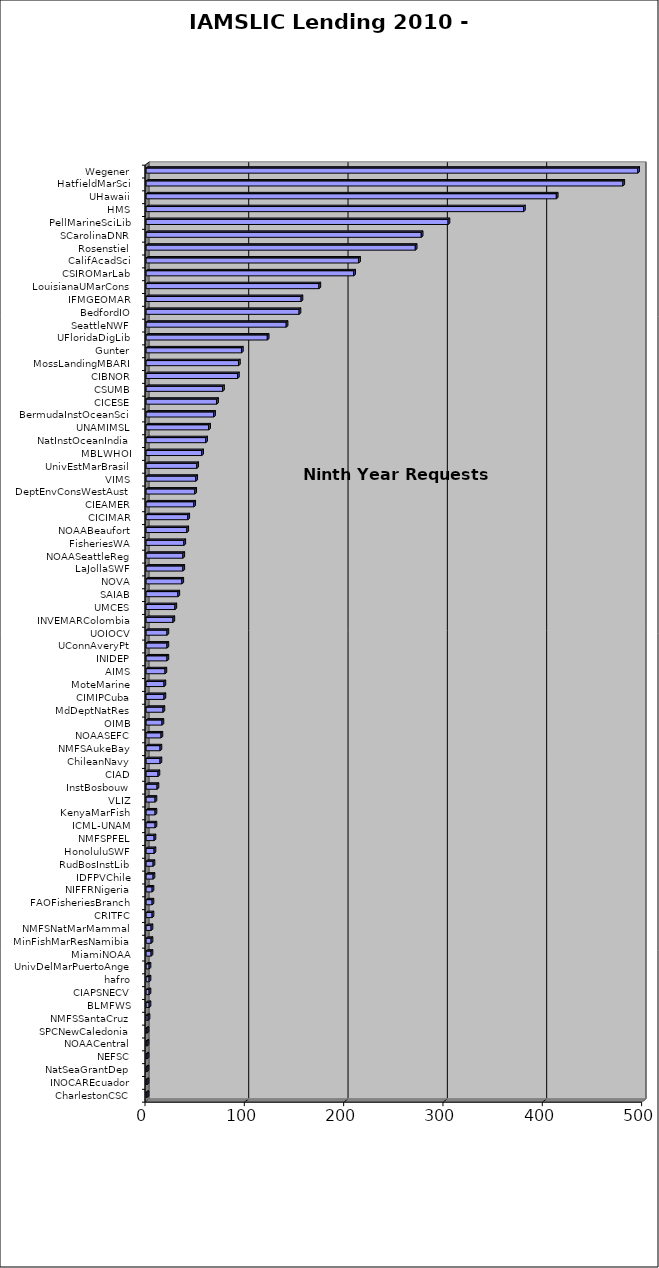
| Category | Series 0 |
|---|---|
| CharlestonCSC  | 1 |
| INOCAREcuador  | 1 |
| NatSeaGrantDep  | 1 |
| NEFSC  | 1 |
| NOAACentral  | 1 |
| SPCNewCaledonia  | 1 |
| NMFSSantaCruz  | 2 |
| BLMFWS  | 3 |
| CIAPSNECV  | 3 |
| hafro  | 3 |
| UnivDelMarPuertoAnge  | 3 |
| MiamiNOAA  | 5 |
| MinFishMarResNamibia  | 5 |
| NMFSNatMarMammal  | 5 |
| CRITFC  | 6 |
| FAOFisheriesBranch  | 6 |
| NIFFRNigeria  | 6 |
| IDFPVChile  | 7 |
| RudBosInstLib  | 7 |
| HonoluluSWF  | 8 |
| NMFSPFEL  | 8 |
| ICML-UNAM  | 9 |
| KenyaMarFish  | 9 |
| VLIZ  | 9 |
| InstBosbouw  | 11 |
| CIAD  | 12 |
| ChileanNavy  | 14 |
| NMFSAukeBay  | 14 |
| NOAASEFC  | 15 |
| OIMB  | 16 |
| MdDeptNatRes  | 17 |
| CIMIPCuba  | 18 |
| MoteMarine  | 18 |
| AIMS  | 19 |
| INIDEP  | 21 |
| UConnAveryPt  | 21 |
| UOIOCV  | 21 |
| INVEMARColombia  | 27 |
| UMCES  | 29 |
| SAIAB  | 32 |
| NOVA  | 36 |
| LaJollaSWF  | 37 |
| NOAASeattleReg  | 37 |
| FisheriesWA  | 38 |
| NOAABeaufort  | 41 |
| CICIMAR  | 42 |
| CIEAMER  | 48 |
| DeptEnvConsWestAust  | 49 |
| VIMS  | 50 |
| UnivEstMarBrasil  | 51 |
| MBLWHOI  | 56 |
| NatInstOceanIndia  | 60 |
| UNAMIMSL  | 63 |
| BermudaInstOceanSci  | 68 |
| CICESE  | 71 |
| CSUMB  | 77 |
| CIBNOR  | 92 |
| MossLandingMBARI  | 93 |
| Gunter  | 96 |
| UFloridaDigLib  | 122 |
| SeattleNWF  | 141 |
| BedfordIO  | 154 |
| IFMGEOMAR  | 156 |
| LouisianaUMarCons  | 174 |
| CSIROMarLab  | 209 |
| CalifAcadSci  | 214 |
| Rosenstiel  | 271 |
| SCarolinaDNR  | 277 |
| PellMarineSciLib  | 304 |
| HMS  | 380 |
| UHawaii  | 413 |
| HatfieldMarSci  | 480 |
| Wegener  | 495 |